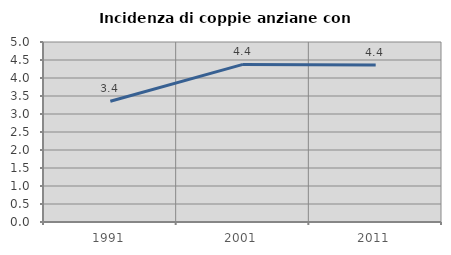
| Category | Incidenza di coppie anziane con figli |
|---|---|
| 1991.0 | 3.356 |
| 2001.0 | 4.377 |
| 2011.0 | 4.363 |